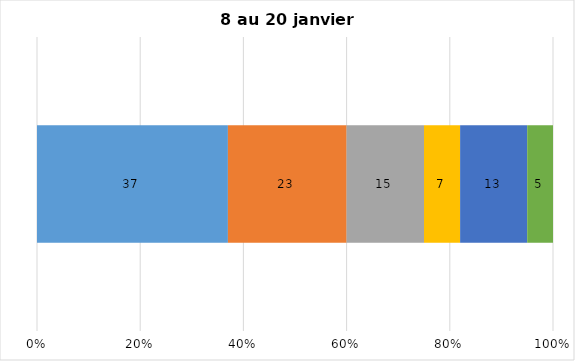
| Category | Plusieurs fois par jour | Une fois par jour | Quelques fois par semaine   | Une fois par semaine ou moins   |  Jamais   |  Je n’utilise pas les médias sociaux |
|---|---|---|---|---|---|---|
| 0 | 37 | 23 | 15 | 7 | 13 | 5 |